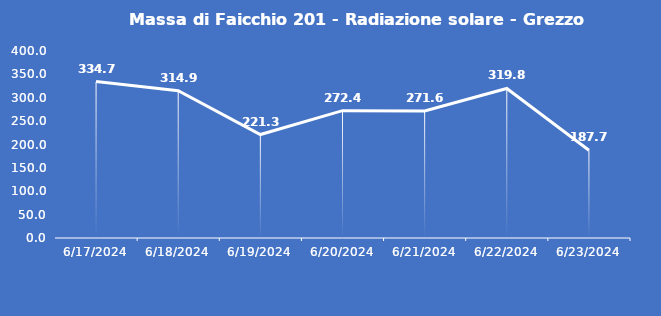
| Category | Massa di Faicchio 201 - Radiazione solare - Grezzo (W/m2) |
|---|---|
| 6/17/24 | 334.7 |
| 6/18/24 | 314.9 |
| 6/19/24 | 221.3 |
| 6/20/24 | 272.4 |
| 6/21/24 | 271.6 |
| 6/22/24 | 319.8 |
| 6/23/24 | 187.7 |